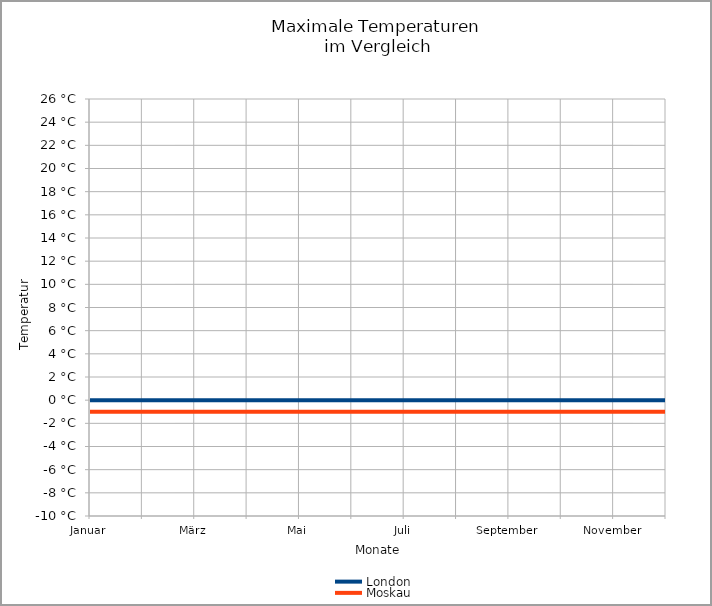
| Category | London | Moskau |
|---|---|---|
| Januar | 0 | -1 |
| Februar | 0 | -1 |
| März | 0 | -1 |
| April | 0 | -1 |
| Mai | 0 | -1 |
| Juni | 0 | -1 |
| Juli | 0 | -1 |
| August | 0 | -1 |
| September | 0 | -1 |
| Oktober | 0 | -1 |
| November | 0 | -1 |
| Dezember | 0 | -1 |